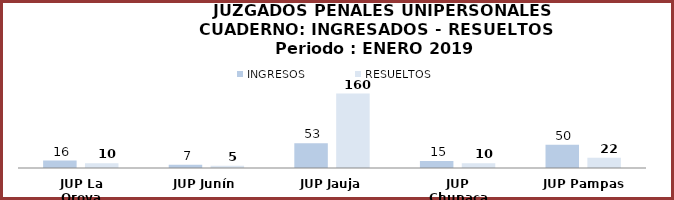
| Category | INGRESOS | RESUELTOS |
|---|---|---|
| JUP La Oroya | 16 | 10 |
| JUP Junín | 7 | 5 |
| JUP Jauja | 53 | 160 |
| JUP Chupaca | 15 | 10 |
| JUP Pampas | 50 | 22 |